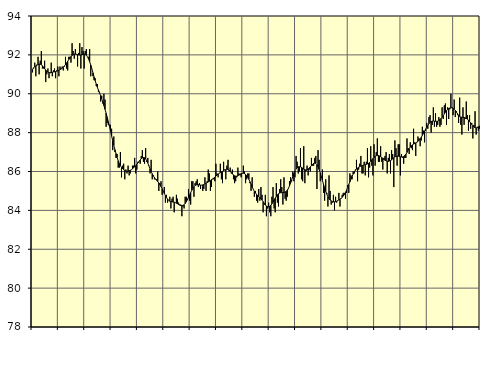
| Category | Piggar | Series 1 |
|---|---|---|
| nan | 91.1 | 91.25 |
| 87.0 | 91.3 | 91.34 |
| 87.0 | 91.6 | 91.39 |
| 87.0 | 90.9 | 91.43 |
| 87.0 | 91.5 | 91.47 |
| 87.0 | 91.9 | 91.5 |
| 87.0 | 91 | 91.53 |
| 87.0 | 91.7 | 91.52 |
| 87.0 | 92.2 | 91.49 |
| 87.0 | 91.3 | 91.44 |
| 87.0 | 91.3 | 91.37 |
| 87.0 | 91.7 | 91.29 |
| nan | 90.6 | 91.22 |
| 88.0 | 91 | 91.16 |
| 88.0 | 91.3 | 91.12 |
| 88.0 | 90.8 | 91.09 |
| 88.0 | 91.1 | 91.08 |
| 88.0 | 91.6 | 91.09 |
| 88.0 | 90.9 | 91.1 |
| 88.0 | 91.2 | 91.12 |
| 88.0 | 91.3 | 91.13 |
| 88.0 | 90.8 | 91.14 |
| 88.0 | 91.2 | 91.16 |
| 88.0 | 91.4 | 91.18 |
| nan | 90.9 | 91.21 |
| 89.0 | 91.4 | 91.24 |
| 89.0 | 91.3 | 91.27 |
| 89.0 | 91.4 | 91.32 |
| 89.0 | 91.2 | 91.37 |
| 89.0 | 91.4 | 91.43 |
| 89.0 | 91.9 | 91.5 |
| 89.0 | 91.3 | 91.59 |
| 89.0 | 91.2 | 91.67 |
| 89.0 | 91.9 | 91.76 |
| 89.0 | 91.9 | 91.84 |
| 89.0 | 91.6 | 91.92 |
| nan | 92.6 | 91.97 |
| 90.0 | 92.2 | 92.01 |
| 90.0 | 91.8 | 92.04 |
| 90.0 | 92.3 | 92.04 |
| 90.0 | 92 | 92.03 |
| 90.0 | 91.4 | 92.01 |
| 90.0 | 92.1 | 92 |
| 90.0 | 92.6 | 91.99 |
| 90.0 | 91.3 | 91.99 |
| 90.0 | 92.4 | 92.01 |
| 90.0 | 92.2 | 92.03 |
| 90.0 | 91.3 | 92.04 |
| nan | 92.2 | 92.02 |
| 91.0 | 92.3 | 91.98 |
| 91.0 | 91.9 | 91.9 |
| 91.0 | 91.9 | 91.79 |
| 91.0 | 92.3 | 91.64 |
| 91.0 | 90.9 | 91.48 |
| 91.0 | 91.3 | 91.29 |
| 91.0 | 90.9 | 91.08 |
| 91.0 | 90.7 | 90.87 |
| 91.0 | 90.8 | 90.68 |
| 91.0 | 90.4 | 90.5 |
| 91.0 | 90.5 | 90.34 |
| nan | 90.1 | 90.19 |
| 92.0 | 90.1 | 90.04 |
| 92.0 | 89.6 | 89.89 |
| 92.0 | 89.9 | 89.74 |
| 92.0 | 89.5 | 89.57 |
| 92.0 | 90 | 89.39 |
| 92.0 | 89.7 | 89.2 |
| 92.0 | 88.3 | 89 |
| 92.0 | 88.5 | 88.79 |
| 92.0 | 88.4 | 88.56 |
| 92.0 | 88.4 | 88.33 |
| 92.0 | 88.4 | 88.08 |
| nan | 88.2 | 87.83 |
| 93.0 | 87.1 | 87.59 |
| 93.0 | 87.8 | 87.35 |
| 93.0 | 87 | 87.13 |
| 93.0 | 86.7 | 86.92 |
| 93.0 | 86.9 | 86.72 |
| 93.0 | 86.2 | 86.55 |
| 93.0 | 86.2 | 86.41 |
| 93.0 | 87 | 86.3 |
| 93.0 | 85.7 | 86.21 |
| 93.0 | 86.3 | 86.14 |
| 93.0 | 86.4 | 86.09 |
| nan | 85.6 | 86.05 |
| 94.0 | 86.1 | 86.02 |
| 94.0 | 85.9 | 86.01 |
| 94.0 | 86.3 | 86.02 |
| 94.0 | 85.8 | 86.04 |
| 94.0 | 85.9 | 86.06 |
| 94.0 | 86.1 | 86.09 |
| 94.0 | 86.3 | 86.14 |
| 94.0 | 86.3 | 86.19 |
| 94.0 | 86.7 | 86.24 |
| 94.0 | 85.9 | 86.3 |
| 94.0 | 86.1 | 86.37 |
| nan | 86.5 | 86.44 |
| 95.0 | 86.5 | 86.52 |
| 95.0 | 86.4 | 86.59 |
| 95.0 | 86.8 | 86.66 |
| 95.0 | 87.1 | 86.7 |
| 95.0 | 86.5 | 86.72 |
| 95.0 | 86.4 | 86.71 |
| 95.0 | 87.2 | 86.65 |
| 95.0 | 86.5 | 86.55 |
| 95.0 | 86.7 | 86.43 |
| 95.0 | 86.3 | 86.28 |
| 95.0 | 85.9 | 86.14 |
| nan | 86.6 | 86 |
| 96.0 | 85.6 | 85.88 |
| 96.0 | 85.8 | 85.77 |
| 96.0 | 85.6 | 85.69 |
| 96.0 | 85.6 | 85.61 |
| 96.0 | 85.6 | 85.55 |
| 96.0 | 86 | 85.48 |
| 96.0 | 85 | 85.41 |
| 96.0 | 85.4 | 85.32 |
| 96.0 | 85.5 | 85.22 |
| 96.0 | 84.8 | 85.11 |
| 96.0 | 85 | 84.99 |
| nan | 85.2 | 84.87 |
| 97.0 | 84.4 | 84.76 |
| 97.0 | 84.8 | 84.66 |
| 97.0 | 84.4 | 84.58 |
| 97.0 | 84.5 | 84.51 |
| 97.0 | 84.7 | 84.47 |
| 97.0 | 84.1 | 84.45 |
| 97.0 | 84.6 | 84.44 |
| 97.0 | 84.7 | 84.43 |
| 97.0 | 83.9 | 84.42 |
| 97.0 | 84.4 | 84.4 |
| 97.0 | 84.8 | 84.37 |
| nan | 84.6 | 84.34 |
| 98.0 | 84.4 | 84.3 |
| 98.0 | 84.3 | 84.27 |
| 98.0 | 84.3 | 84.25 |
| 98.0 | 83.7 | 84.24 |
| 98.0 | 84.2 | 84.25 |
| 98.0 | 84.1 | 84.29 |
| 98.0 | 84.7 | 84.35 |
| 98.0 | 84.7 | 84.44 |
| 98.0 | 84.6 | 84.54 |
| 98.0 | 85.1 | 84.66 |
| 98.0 | 84.5 | 84.79 |
| nan | 84.3 | 84.91 |
| 99.0 | 85.5 | 85.03 |
| 99.0 | 85.5 | 85.13 |
| 99.0 | 84.7 | 85.21 |
| 99.0 | 85.4 | 85.27 |
| 99.0 | 85.5 | 85.31 |
| 99.0 | 85.6 | 85.32 |
| 99.0 | 85.2 | 85.32 |
| 99.0 | 85.4 | 85.31 |
| 99.0 | 85.1 | 85.3 |
| 99.0 | 85.3 | 85.3 |
| 99.0 | 85 | 85.31 |
| nan | 85.1 | 85.33 |
| 0.0 | 85.7 | 85.36 |
| 0.0 | 85 | 85.39 |
| 0.0 | 85.5 | 85.42 |
| 0.0 | 86.1 | 85.46 |
| 0.0 | 85.9 | 85.5 |
| 0.0 | 85 | 85.54 |
| 0.0 | 85.2 | 85.58 |
| 0.0 | 85.6 | 85.62 |
| 0.0 | 85.6 | 85.66 |
| 0.0 | 85.5 | 85.71 |
| 0.0 | 86.4 | 85.76 |
| nan | 85.9 | 85.82 |
| 1.0 | 85.7 | 85.86 |
| 1.0 | 85.9 | 85.91 |
| 1.0 | 86.4 | 85.94 |
| 1.0 | 85.6 | 85.98 |
| 1.0 | 85.4 | 86.01 |
| 1.0 | 86.5 | 86.04 |
| 1.0 | 86.1 | 86.08 |
| 1.0 | 85.6 | 86.1 |
| 1.0 | 86.3 | 86.12 |
| 1.0 | 86.6 | 86.1 |
| 1.0 | 86 | 86.07 |
| nan | 86.2 | 86.02 |
| 2.0 | 85.9 | 85.95 |
| 2.0 | 86.1 | 85.88 |
| 2.0 | 85.6 | 85.82 |
| 2.0 | 85.4 | 85.78 |
| 2.0 | 85.5 | 85.76 |
| 2.0 | 85.7 | 85.76 |
| 2.0 | 86.2 | 85.78 |
| 2.0 | 85.9 | 85.82 |
| 2.0 | 85.8 | 85.86 |
| 2.0 | 85.7 | 85.89 |
| 2.0 | 85.9 | 85.91 |
| nan | 86.3 | 85.91 |
| 3.0 | 86 | 85.89 |
| 3.0 | 85.4 | 85.85 |
| 3.0 | 85.6 | 85.78 |
| 3.0 | 85.9 | 85.7 |
| 3.0 | 85.9 | 85.6 |
| 3.0 | 85.4 | 85.47 |
| 3.0 | 85 | 85.34 |
| 3.0 | 85.7 | 85.21 |
| 3.0 | 85.1 | 85.09 |
| 3.0 | 84.7 | 84.98 |
| 3.0 | 85 | 84.9 |
| nan | 84.5 | 84.82 |
| 4.0 | 84.4 | 84.76 |
| 4.0 | 85.1 | 84.71 |
| 4.0 | 84.5 | 84.66 |
| 4.0 | 85.2 | 84.6 |
| 4.0 | 84.8 | 84.53 |
| 4.0 | 83.9 | 84.45 |
| 4.0 | 84.3 | 84.36 |
| 4.0 | 84.8 | 84.28 |
| 4.0 | 83.7 | 84.22 |
| 4.0 | 84.1 | 84.19 |
| 4.0 | 84.4 | 84.18 |
| nan | 83.9 | 84.21 |
| 5.0 | 83.7 | 84.26 |
| 5.0 | 84.7 | 84.34 |
| 5.0 | 85.2 | 84.43 |
| 5.0 | 84.1 | 84.53 |
| 5.0 | 83.9 | 84.62 |
| 5.0 | 85.4 | 84.72 |
| 5.0 | 84.4 | 84.8 |
| 5.0 | 84.2 | 84.86 |
| 5.0 | 85.1 | 84.89 |
| 5.0 | 85.6 | 84.91 |
| 5.0 | 85.2 | 84.91 |
| nan | 84.3 | 84.91 |
| 6.0 | 85.7 | 84.92 |
| 6.0 | 84.6 | 84.94 |
| 6.0 | 84.5 | 84.98 |
| 6.0 | 84.7 | 85.04 |
| 6.0 | 85.1 | 85.13 |
| 6.0 | 85.5 | 85.26 |
| 6.0 | 85.7 | 85.41 |
| 6.0 | 85.5 | 85.57 |
| 6.0 | 86 | 85.74 |
| 6.0 | 85.5 | 85.9 |
| 6.0 | 85.7 | 86.03 |
| nan | 86.8 | 86.13 |
| 7.0 | 86.5 | 86.2 |
| 7.0 | 85.9 | 86.24 |
| 7.0 | 86 | 86.25 |
| 7.0 | 87.2 | 86.24 |
| 7.0 | 85.6 | 86.21 |
| 7.0 | 85.5 | 86.17 |
| 7.0 | 87.3 | 86.12 |
| 7.0 | 85.4 | 86.09 |
| 7.0 | 86 | 86.08 |
| 7.0 | 86.3 | 86.09 |
| 7.0 | 85.8 | 86.13 |
| nan | 86.1 | 86.18 |
| 8.0 | 86 | 86.24 |
| 8.0 | 86.7 | 86.31 |
| 8.0 | 86.3 | 86.37 |
| 8.0 | 86.3 | 86.42 |
| 8.0 | 86.7 | 86.43 |
| 8.0 | 86.8 | 86.41 |
| 8.0 | 85.1 | 86.35 |
| 8.0 | 87.1 | 86.25 |
| 8.0 | 86.6 | 86.1 |
| 8.0 | 85.5 | 85.93 |
| 8.0 | 85.7 | 85.74 |
| nan | 86.1 | 85.54 |
| 9.0 | 84.9 | 85.34 |
| 9.0 | 84.5 | 85.16 |
| 9.0 | 85.6 | 84.98 |
| 9.0 | 84.9 | 84.83 |
| 9.0 | 84.2 | 84.7 |
| 9.0 | 85.8 | 84.61 |
| 9.0 | 85 | 84.53 |
| 9.0 | 84.3 | 84.49 |
| 9.0 | 84.4 | 84.45 |
| 9.0 | 84.8 | 84.44 |
| 9.0 | 84 | 84.44 |
| nan | 84.7 | 84.45 |
| 10.0 | 84.4 | 84.47 |
| 10.0 | 84.5 | 84.51 |
| 10.0 | 84.9 | 84.54 |
| 10.0 | 84.2 | 84.57 |
| 10.0 | 84.6 | 84.62 |
| 10.0 | 84.8 | 84.67 |
| 10.0 | 84.9 | 84.74 |
| 10.0 | 84.9 | 84.82 |
| 10.0 | 84.6 | 84.92 |
| 10.0 | 84.9 | 85.05 |
| 10.0 | 85.3 | 85.18 |
| nan | 84.9 | 85.33 |
| 11.0 | 85.9 | 85.47 |
| 11.0 | 85.8 | 85.61 |
| 11.0 | 85.6 | 85.75 |
| 11.0 | 86 | 85.87 |
| 11.0 | 85.9 | 85.98 |
| 11.0 | 86.1 | 86.06 |
| 11.0 | 86.6 | 86.13 |
| 11.0 | 85.5 | 86.18 |
| 11.0 | 86.1 | 86.22 |
| 11.0 | 86.4 | 86.25 |
| 11.0 | 86.8 | 86.28 |
| nan | 85.9 | 86.3 |
| 12.0 | 85.9 | 86.32 |
| 12.0 | 86.5 | 86.34 |
| 12.0 | 85.8 | 86.35 |
| 12.0 | 86.5 | 86.37 |
| 12.0 | 87.2 | 86.39 |
| 12.0 | 85.7 | 86.42 |
| 12.0 | 86.2 | 86.46 |
| 12.0 | 87.3 | 86.52 |
| 12.0 | 86.3 | 86.6 |
| 12.0 | 85.8 | 86.67 |
| 12.0 | 87.4 | 86.73 |
| nan | 86.3 | 86.78 |
| 13.0 | 87 | 86.81 |
| 13.0 | 87.7 | 86.83 |
| 13.0 | 86.5 | 86.82 |
| 13.0 | 86.5 | 86.8 |
| 13.0 | 87.3 | 86.76 |
| 13.0 | 86.5 | 86.72 |
| 13.0 | 86.1 | 86.67 |
| 13.0 | 86.7 | 86.62 |
| 13.0 | 86.8 | 86.58 |
| 13.0 | 87 | 86.55 |
| 13.0 | 85.9 | 86.53 |
| nan | 86.7 | 86.52 |
| 14.0 | 86.9 | 86.54 |
| 14.0 | 85.9 | 86.56 |
| 14.0 | 87.1 | 86.6 |
| 14.0 | 86.9 | 86.65 |
| 14.0 | 85.2 | 86.71 |
| 14.0 | 87.6 | 86.75 |
| 14.0 | 87.2 | 86.78 |
| 14.0 | 86.3 | 86.79 |
| 14.0 | 87.4 | 86.79 |
| 14.0 | 87.4 | 86.77 |
| 14.0 | 85.8 | 86.76 |
| nan | 86.9 | 86.75 |
| 15.0 | 86.7 | 86.75 |
| 15.0 | 86.4 | 86.77 |
| 15.0 | 86.7 | 86.82 |
| 15.0 | 86.7 | 86.89 |
| 15.0 | 87.7 | 86.98 |
| 15.0 | 87.2 | 87.09 |
| 15.0 | 86.9 | 87.18 |
| 15.0 | 87.5 | 87.26 |
| 15.0 | 87.2 | 87.33 |
| 15.0 | 87.1 | 87.37 |
| 15.0 | 88.2 | 87.41 |
| nan | 87.5 | 87.44 |
| 16.0 | 86.8 | 87.47 |
| 16.0 | 87.5 | 87.51 |
| 16.0 | 87.8 | 87.55 |
| 16.0 | 87.7 | 87.61 |
| 16.0 | 87.3 | 87.68 |
| 16.0 | 87.6 | 87.76 |
| 16.0 | 88.3 | 87.86 |
| 16.0 | 88.1 | 87.96 |
| 16.0 | 87.5 | 88.07 |
| 16.0 | 88.1 | 88.18 |
| 16.0 | 88.5 | 88.28 |
| nan | 88.2 | 88.37 |
| 17.0 | 88.8 | 88.46 |
| 17.0 | 88.9 | 88.53 |
| 17.0 | 88 | 88.57 |
| 17.0 | 88.4 | 88.59 |
| 17.0 | 89.3 | 88.6 |
| 17.0 | 88.3 | 88.59 |
| 17.0 | 89 | 88.58 |
| 17.0 | 88.3 | 88.58 |
| 17.0 | 88.4 | 88.59 |
| 17.0 | 88.8 | 88.62 |
| 17.0 | 88.3 | 88.67 |
| nan | 88.4 | 88.73 |
| 18.0 | 89.3 | 88.8 |
| 18.0 | 88.7 | 88.87 |
| 18.0 | 89.4 | 88.96 |
| 18.0 | 89.5 | 89.05 |
| 18.0 | 88.4 | 89.13 |
| 18.0 | 89.3 | 89.19 |
| 18.0 | 88.7 | 89.24 |
| 18.0 | 89.2 | 89.27 |
| 18.0 | 90 | 89.28 |
| 18.0 | 89.3 | 89.28 |
| 18.0 | 88.9 | 89.25 |
| nan | 89.7 | 89.2 |
| 19.0 | 88.8 | 89.14 |
| 19.0 | 89.1 | 89.05 |
| 19.0 | 88.9 | 88.97 |
| 19.0 | 88.5 | 88.89 |
| 19.0 | 89.8 | 88.83 |
| 19.0 | 88.4 | 88.8 |
| 19.0 | 87.9 | 88.79 |
| 19.0 | 89.3 | 88.78 |
| 19.0 | 88.4 | 88.78 |
| 19.0 | 88.7 | 88.76 |
| 19.0 | 89.6 | 88.73 |
| nan | 88.9 | 88.7 |
| 20.0 | 88.1 | 88.64 |
| 20.0 | 88.9 | 88.57 |
| 20.0 | 88.2 | 88.5 |
| 20.0 | 88.5 | 88.42 |
| 20.0 | 87.7 | 88.35 |
| 20.0 | 88.4 | 88.29 |
| 20.0 | 89.1 | 88.25 |
| 20.0 | 87.9 | 88.24 |
| 20.0 | 88.3 | 88.25 |
| 20.0 | 88.1 | 88.29 |
| 20.0 | 88.2 | 88.35 |